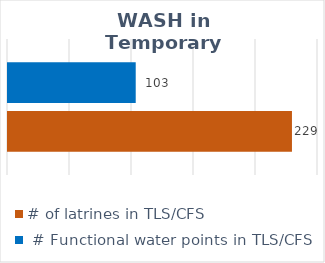
| Category | # of latrines in TLS/CFS |  # Functional water points in TLS/CFS |
|---|---|---|
| Central Rakhine | 229 | 103 |